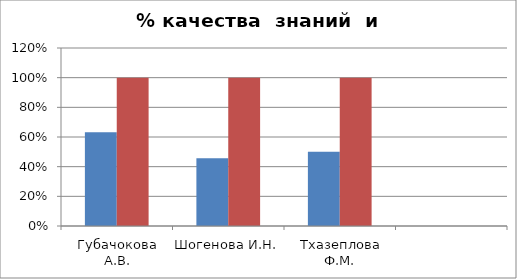
| Category | Series 0 | 2 |
|---|---|---|
| Губачокова А.В. | 0.632 | 1 |
| Шогенова И.Н. | 0.457 | 1 |
| Тхазеплова Ф.М. | 0.5 | 1 |